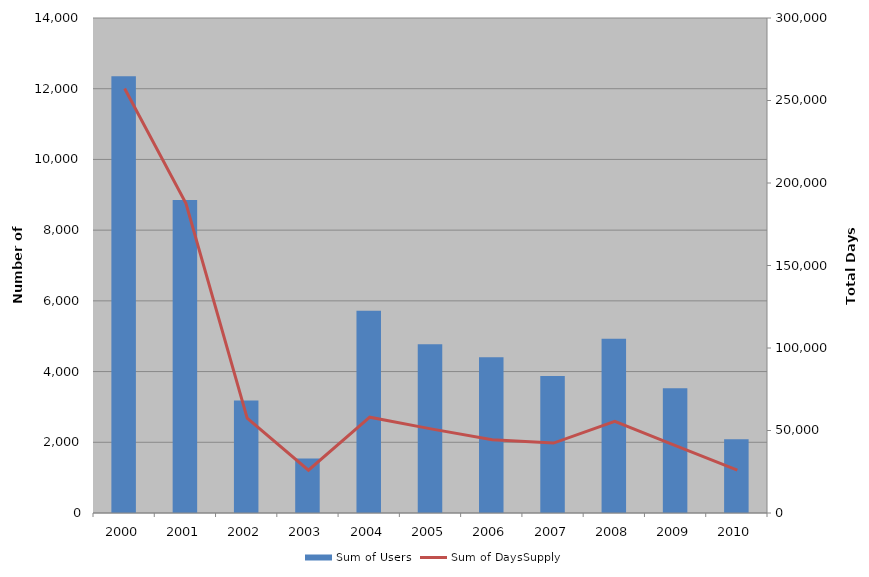
| Category | Sum of Users |
|---|---|
| 2000 | 12353 |
| 2001 | 8855 |
| 2002 | 3179 |
| 2003 | 1541 |
| 2004 | 5723 |
| 2005 | 4770 |
| 2006 | 4403 |
| 2007 | 3872 |
| 2008 | 4928 |
| 2009 | 3526 |
| 2010 | 2087 |